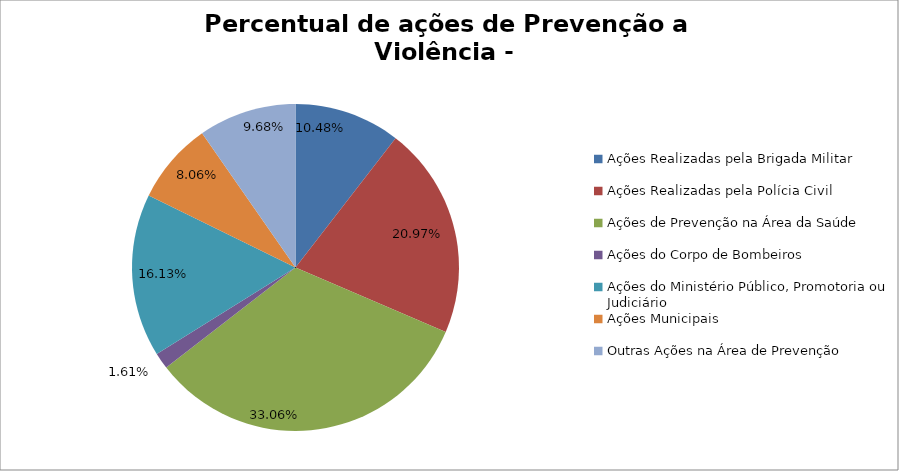
| Category | Percentual |
|---|---|
| Ações Realizadas pela Brigada Militar | 0.105 |
| Ações Realizadas pela Polícia Civil | 0.21 |
| Ações de Prevenção na Área da Saúde | 0.331 |
| Ações do Corpo de Bombeiros | 0.016 |
| Ações do Ministério Público, Promotoria ou Judiciário | 0.161 |
| Ações Municipais | 0.081 |
| Outras Ações na Área de Prevenção | 0.097 |